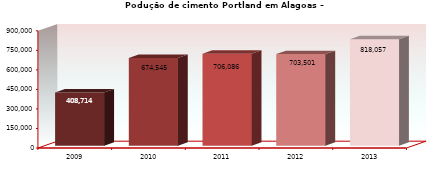
| Category | CIMENTO ( t )  |
|---|---|
| 2009.0 | 408714 |
| 2010.0 | 674545 |
| 2011.0 | 706086 |
| 2012.0 | 703501 |
| 2013.0 | 818057 |